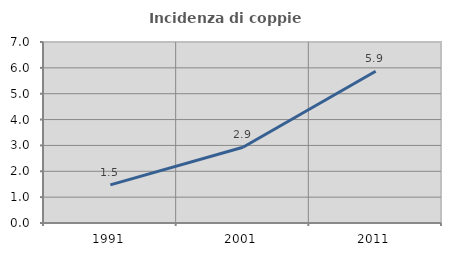
| Category | Incidenza di coppie miste |
|---|---|
| 1991.0 | 1.474 |
| 2001.0 | 2.928 |
| 2011.0 | 5.87 |